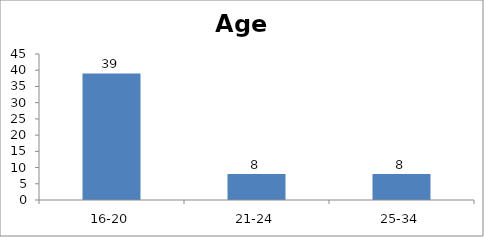
| Category | Age |
|---|---|
| 16-20 | 39 |
| 21-24 | 8 |
| 25-34 | 8 |